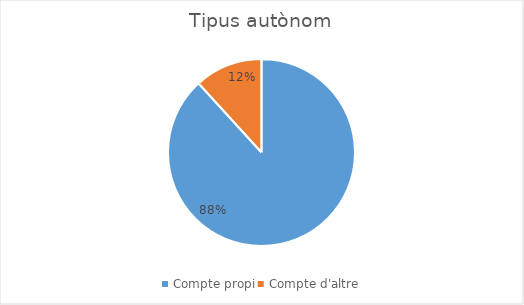
| Category | Series 0 |
|---|---|
| Compte propi | 15 |
| Compte d'altre | 2 |